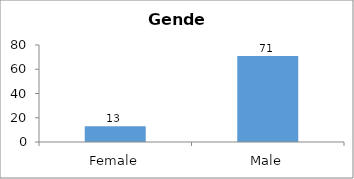
| Category | Gender |
|---|---|
| Female | 13 |
| Male | 71 |